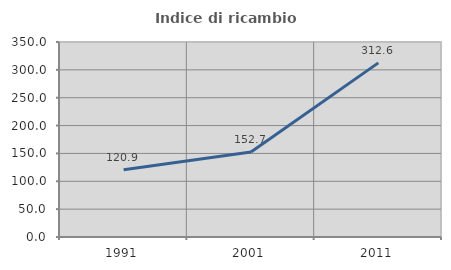
| Category | Indice di ricambio occupazionale  |
|---|---|
| 1991.0 | 120.863 |
| 2001.0 | 152.692 |
| 2011.0 | 312.565 |